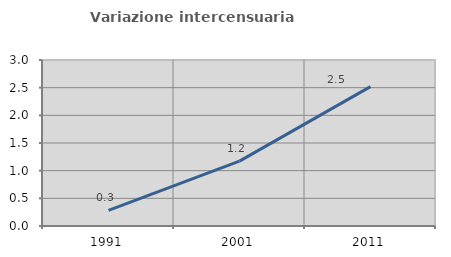
| Category | Variazione intercensuaria annua |
|---|---|
| 1991.0 | 0.281 |
| 2001.0 | 1.173 |
| 2011.0 | 2.518 |